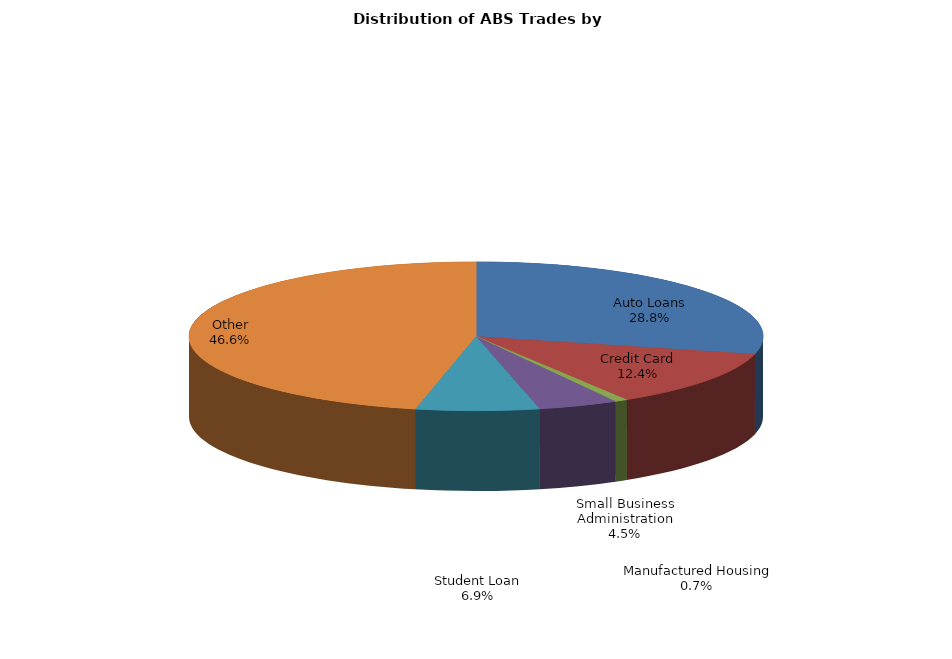
| Category | Series 0 |
|---|---|
| Auto Loans | 114.901 |
| Credit Card | 49.274 |
| Manufactured Housing | 2.905 |
| Small Business Administration | 17.964 |
| Student Loan | 27.687 |
| Other | 185.698 |